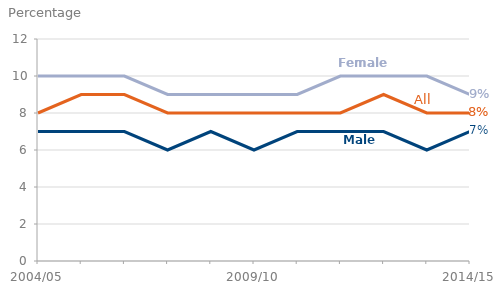
| Category | All | Males | Females |
|---|---|---|---|
| 2004/05 | 8 | 7 | 10 |
| 2005/06 | 9 | 7 | 10 |
| 2006/07 | 9 | 7 | 10 |
| 2007/08 | 8 | 6 | 9 |
| 2008/09 | 8 | 7 | 9 |
| 2009/10 | 8 | 6 | 9 |
| 2010/11 | 8 | 7 | 9 |
| 2011/12 | 8 | 7 | 10 |
| 2012/13 | 9 | 7 | 10 |
| 2013/14 | 8 | 6 | 10 |
| 2014/15 | 8 | 7 | 9 |